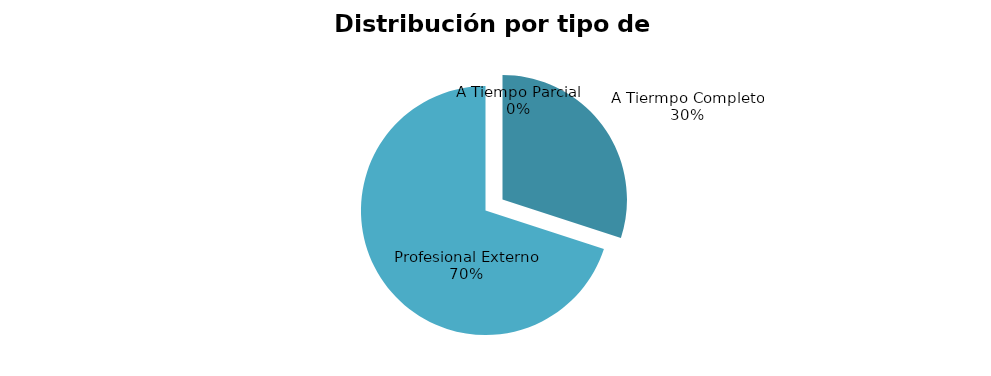
| Category | 3 |
|---|---|
| A Tiermpo Completo | 3 |
| Profesional Externo | 7 |
| A Tiempo Parcial | 0 |